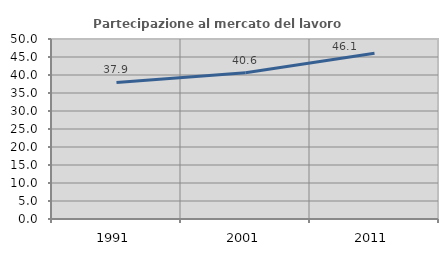
| Category | Partecipazione al mercato del lavoro  femminile |
|---|---|
| 1991.0 | 37.92 |
| 2001.0 | 40.65 |
| 2011.0 | 46.061 |